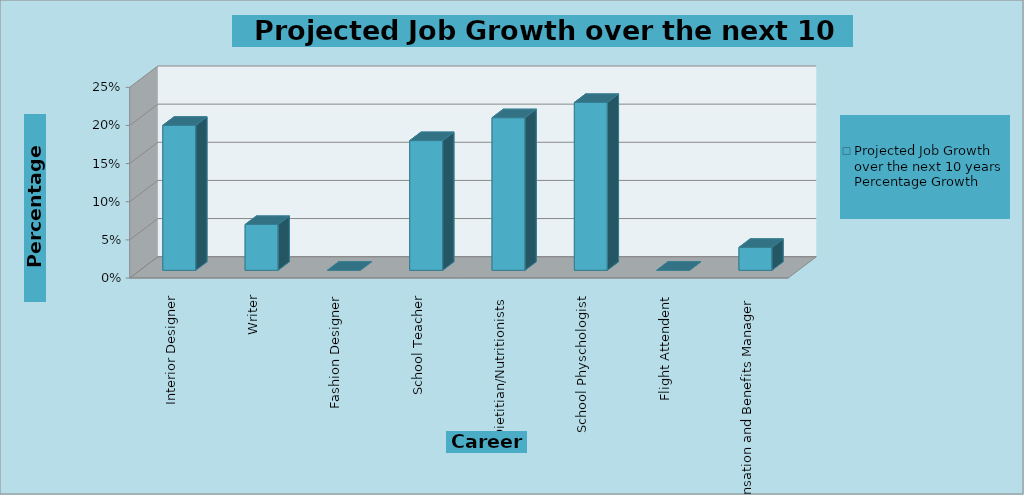
| Category | Projected Job Growth over the next 10 years Percentage Growth  |
|---|---|
| Interior Designer | 0.19 |
| Writer | 0.06 |
| Fashion Designer | 0 |
| School Teacher | 0.17 |
| Dietitian/Nutritionists  | 0.2 |
| School Physchologist | 0.22 |
| Flight Attendent | 0 |
| Compensation and Benefits Manager | 0.03 |